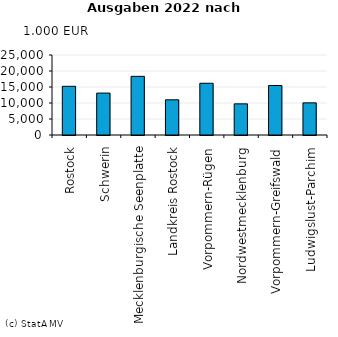
| Category | Ausgaben |
|---|---|
|    Rostock | 15217 |
|    Schwerin | 13096 |
|    Mecklenburgische Seenplatte | 18326 |
|    Landkreis Rostock | 11000 |
|    Vorpommern-Rügen | 16171 |
|    Nordwestmecklenburg | 9733 |
|    Vorpommern-Greifswald | 15470 |
|    Ludwigslust-Parchim | 10046 |